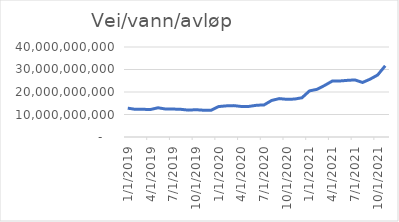
| Category | Vei/vann/avløp |
|---|---|
| 1/1/19 | 12817335666.667 |
| 2/1/19 | 12287577333.333 |
| 3/1/19 | 12302949416.667 |
| 4/1/19 | 12223060250 |
| 5/1/19 | 12992561500 |
| 6/1/19 | 12428821083.333 |
| 7/1/19 | 12420659750 |
| 8/1/19 | 12302339916.667 |
| 9/1/19 | 11941994916.667 |
| 10/1/19 | 12136255833.333 |
| 11/1/19 | 11900077500 |
| 12/1/19 | 11863183333.333 |
| 1/1/20 | 13533291666.667 |
| 2/1/20 | 13832220833.333 |
| 3/1/20 | 13946693750 |
| 4/1/20 | 13566680416.667 |
| 5/1/20 | 13600560416.667 |
| 6/1/20 | 14103035833.333 |
| 7/1/20 | 14266557916.667 |
| 8/1/20 | 16238800750 |
| 9/1/20 | 17064554916.667 |
| 10/1/20 | 16751062833.333 |
| 11/1/20 | 16854536166.667 |
| 12/1/20 | 17426261166.667 |
| 1/1/21 | 20493733250 |
| 2/1/21 | 21188729916.667 |
| 3/1/21 | 22924636166.667 |
| 4/1/21 | 24841890333.333 |
| 5/1/21 | 24898097833.333 |
| 6/1/21 | 25174549083.333 |
| 7/1/21 | 25376623666.667 |
| 8/1/21 | 24227745833.333 |
| 9/1/21 | 25699760833.333 |
| 10/1/21 | 27553438750 |
| 11/1/21 | 31646219583.333 |